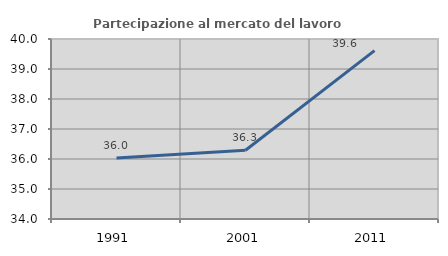
| Category | Partecipazione al mercato del lavoro  femminile |
|---|---|
| 1991.0 | 36.03 |
| 2001.0 | 36.291 |
| 2011.0 | 39.611 |